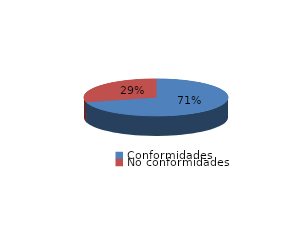
| Category | Series 0 |
|---|---|
| Conformidades | 1750 |
| No conformidades | 720 |